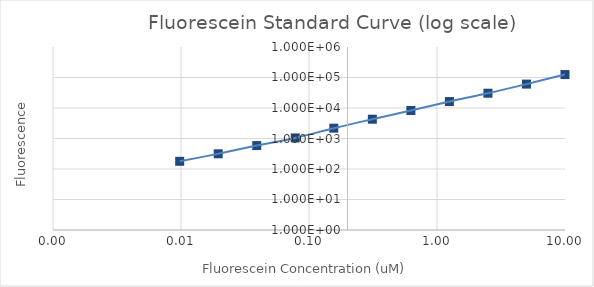
| Category | Series 1 |
|---|---|
| 10.0 | 124867.75 |
| 5.0 | 60737.75 |
| 2.5 | 30528 |
| 1.25 | 16266.75 |
| 0.625 | 8294.5 |
| 0.3125 | 4292 |
| 0.15625 | 2181 |
| 0.078125 | 1043.25 |
| 0.0390625 | 587 |
| 0.01953125 | 315.25 |
| 0.009765625 | 178.75 |